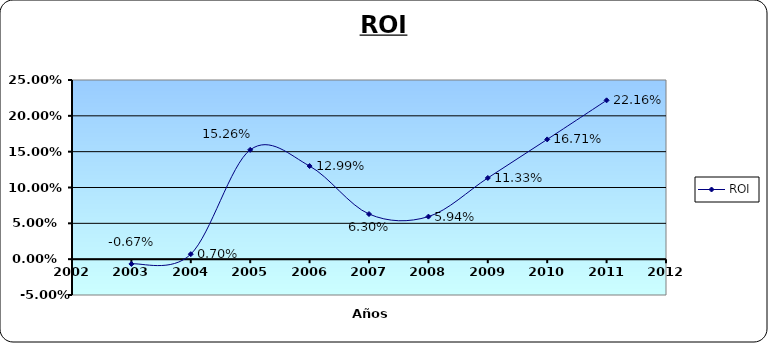
| Category | ROI |
|---|---|
| 2003.0 | -0.007 |
| 2004.0 | 0.007 |
| 2005.0 | 0.153 |
| 2006.0 | 0.13 |
| 2007.0 | 0.063 |
| 2008.0 | 0.059 |
| 2009.0 | 0.113 |
| 2010.0 | 0.167 |
| 2011.0 | 0.222 |